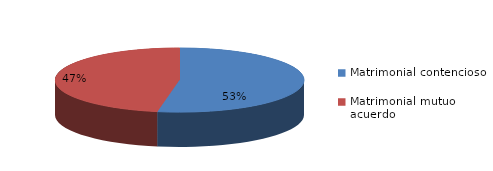
| Category | Series 0 |
|---|---|
| 0 | 917 |
| 1 | 819 |